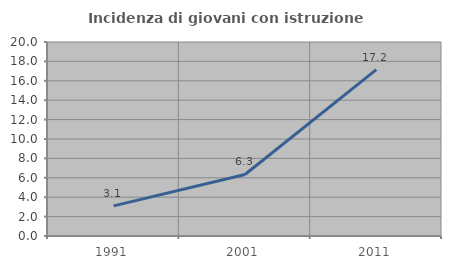
| Category | Incidenza di giovani con istruzione universitaria |
|---|---|
| 1991.0 | 3.106 |
| 2001.0 | 6.341 |
| 2011.0 | 17.157 |